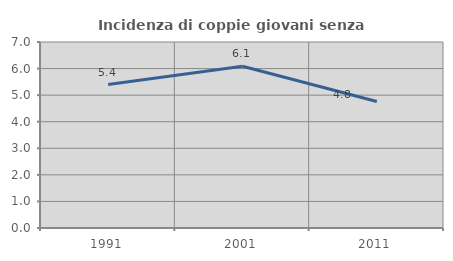
| Category | Incidenza di coppie giovani senza figli |
|---|---|
| 1991.0 | 5.397 |
| 2001.0 | 6.087 |
| 2011.0 | 4.762 |